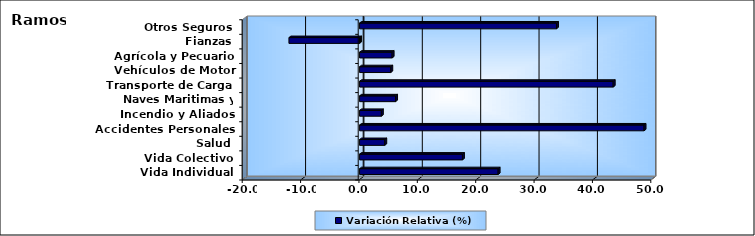
| Category | Variación Relativa (%) |
|---|---|
| Vida Individual | 23.736 |
| Vida Colectivo | 17.621 |
| Salud | 4.31 |
| Accidentes Personales | 48.735 |
| Incendio y Aliados | 3.733 |
| Naves Maritimas y Aéreas | 6.163 |
| Transporte de Carga | 43.447 |
| Vehículos de Motor | 5.34 |
| Agrícola y Pecuario | 5.577 |
| Fianzas | -12.104 |
| Otros Seguros | 33.733 |